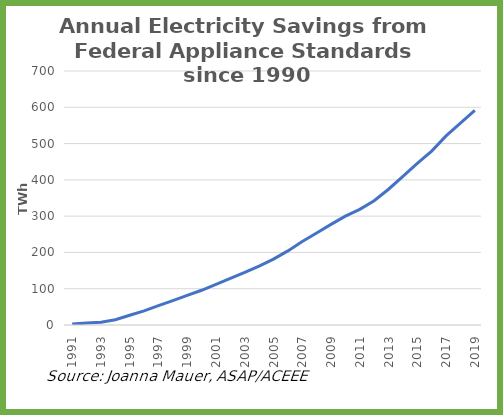
| Category | Series 0 |
|---|---|
| 1991.0 | 2.6 |
| 1992.0 | 5.2 |
| 1993.0 | 7.8 |
| 1994.0 | 14.343 |
| 1995.0 | 26.72 |
| 1996.0 | 39.096 |
| 1997.0 | 53.223 |
| 1998.0 | 67.35 |
| 1999.0 | 81.476 |
| 2000.0 | 95.722 |
| 2001.0 | 112.065 |
| 2002.0 | 128.408 |
| 2003.0 | 144.751 |
| 2004.0 | 162.541 |
| 2005.0 | 181.664 |
| 2006.0 | 204.158 |
| 2007.0 | 230.185 |
| 2008.0 | 253.379 |
| 2009.0 | 277.245 |
| 2010.0 | 300.038 |
| 2011.0 | 318.777 |
| 2012.0 | 342.516 |
| 2013.0 | 374.163 |
| 2014.0 | 409.851 |
| 2015.0 | 445.548 |
| 2016.0 | 479.409 |
| 2017.0 | 521.021 |
| 2018.0 | 556.088 |
| 2019.0 | 591.202 |